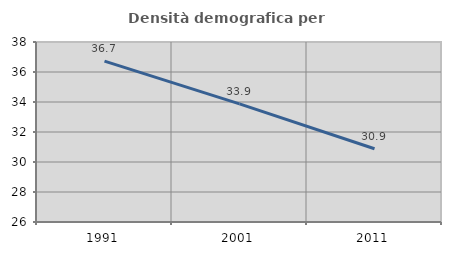
| Category | Densità demografica |
|---|---|
| 1991.0 | 36.725 |
| 2001.0 | 33.872 |
| 2011.0 | 30.882 |